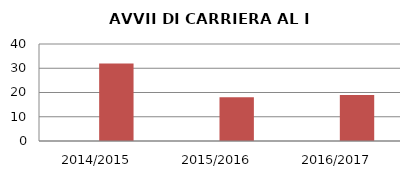
| Category | ANNO | NUMERO |
|---|---|---|
| 2014/2015 | 0 | 32 |
| 2015/2016 | 0 | 18 |
| 2016/2017 | 0 | 19 |